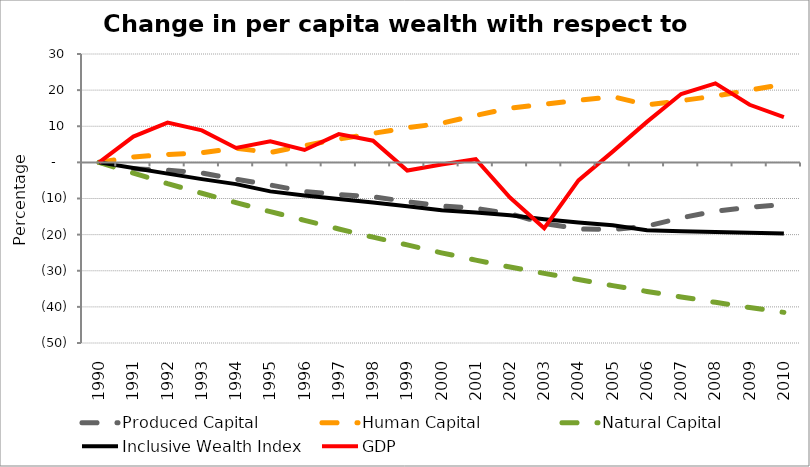
| Category | Produced Capital  | Human Capital | Natural Capital | Inclusive Wealth Index | GDP |
|---|---|---|---|---|---|
| 1990.0 | 0 | 0 | 0 | 0 | 0 |
| 1991.0 | -1.776 | 1.506 | -2.961 | -1.552 | 7.131 |
| 1992.0 | -2.18 | 2.169 | -5.878 | -3.113 | 11.022 |
| 1993.0 | -2.944 | 2.663 | -8.555 | -4.635 | 8.857 |
| 1994.0 | -4.647 | 3.922 | -11.132 | -6.023 | 4.002 |
| 1995.0 | -6.256 | 2.72 | -13.628 | -8.032 | 5.83 |
| 1996.0 | -8.065 | 4.637 | -16.051 | -9.164 | 3.44 |
| 1997.0 | -8.912 | 6.432 | -18.431 | -10.166 | 7.812 |
| 1998.0 | -9.513 | 8.026 | -20.702 | -11.124 | 5.996 |
| 1999.0 | -10.864 | 9.586 | -22.837 | -12.122 | -2.26 |
| 2000.0 | -12.078 | 10.82 | -25.04 | -13.229 | -0.58 |
| 2001.0 | -12.729 | 12.993 | -27.053 | -13.886 | 0.879 |
| 2002.0 | -14.197 | 14.986 | -28.968 | -14.653 | -9.737 |
| 2003.0 | -16.911 | 16.09 | -30.723 | -15.756 | -18.236 |
| 2004.0 | -18.41 | 17.159 | -32.441 | -16.67 | -4.995 |
| 2005.0 | -18.636 | 18.2 | -34.115 | -17.382 | 2.983 |
| 2006.0 | -17.636 | 15.916 | -35.722 | -18.799 | 11.212 |
| 2007.0 | -15.355 | 17.087 | -37.257 | -19.032 | 18.91 |
| 2008.0 | -13.53 | 18.374 | -38.737 | -19.266 | 21.857 |
| 2009.0 | -12.411 | 19.999 | -40.176 | -19.486 | 15.941 |
| 2010.0 | -11.676 | 21.639 | -41.525 | -19.705 | 12.555 |